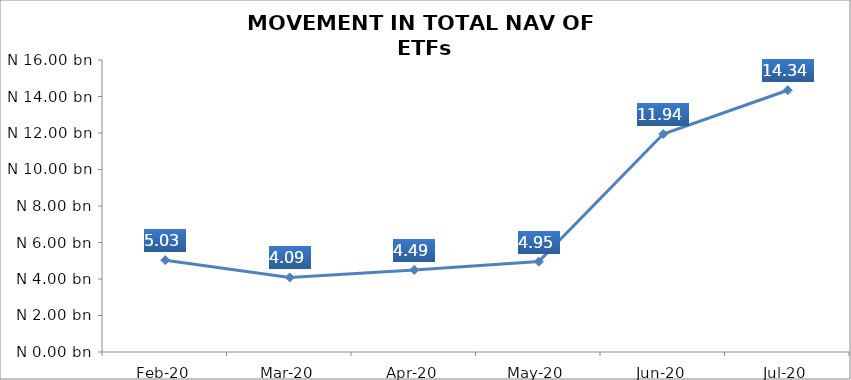
| Category | Series 0 |
|---|---|
| 2020-02-01 | 5030305629.7 |
| 2020-03-01 | 4085799334.74 |
| 2020-04-01 | 4494025633.23 |
| 2020-05-01 | 4952411842.71 |
| 2020-06-01 | 11944935776.22 |
| 2020-07-01 | 14343728259.45 |